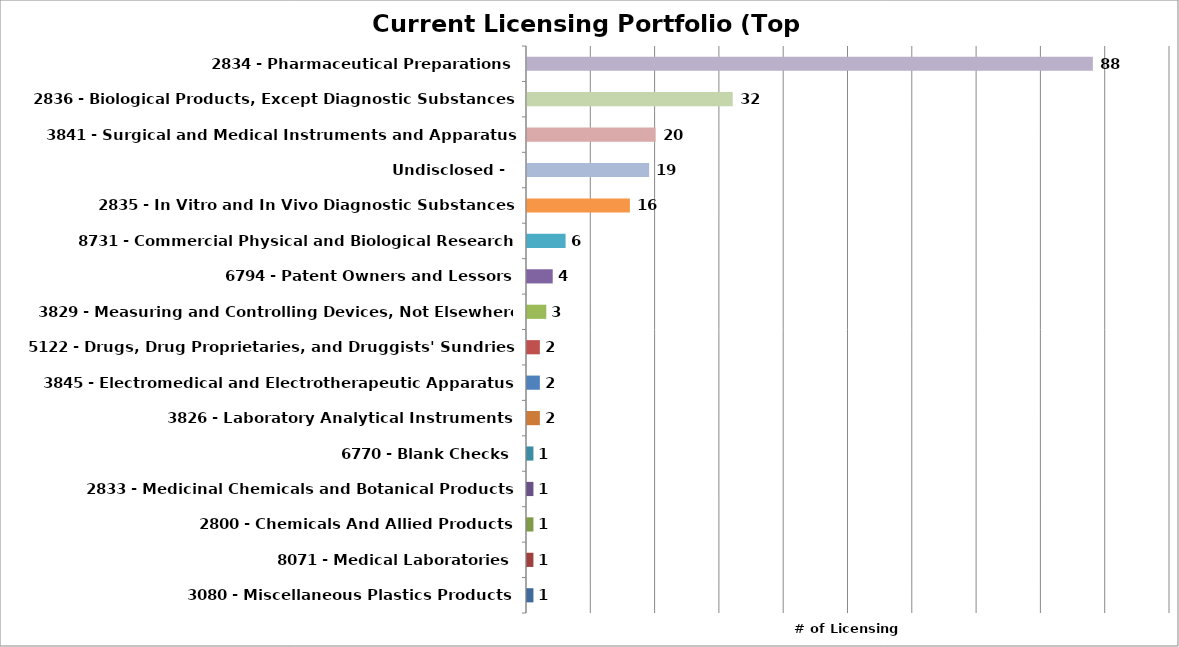
| Category | Series 0 |
|---|---|
| 3080 - Miscellaneous Plastics Products | 1 |
| 8071 - Medical Laboratories | 1 |
| 2800 - Chemicals And Allied Products | 1 |
| 2833 - Medicinal Chemicals and Botanical Products | 1 |
| 6770 - Blank Checks | 1 |
| 3826 - Laboratory Analytical Instruments | 2 |
| 3845 - Electromedical and Electrotherapeutic Apparatus | 2 |
| 5122 - Drugs, Drug Proprietaries, and Druggists' Sundries | 2 |
| 3829 - Measuring and Controlling Devices, Not Elsewhere Classified | 3 |
| 6794 - Patent Owners and Lessors | 4 |
| 8731 - Commercial Physical and Biological Research | 6 |
| 2835 - In Vitro and In Vivo Diagnostic Substances | 16 |
| Undisclosed -  | 19 |
| 3841 - Surgical and Medical Instruments and Apparatus | 20 |
| 2836 - Biological Products, Except Diagnostic Substances | 32 |
| 2834 - Pharmaceutical Preparations | 88 |